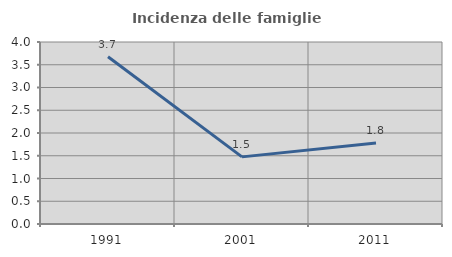
| Category | Incidenza delle famiglie numerose |
|---|---|
| 1991.0 | 3.677 |
| 2001.0 | 1.475 |
| 2011.0 | 1.779 |